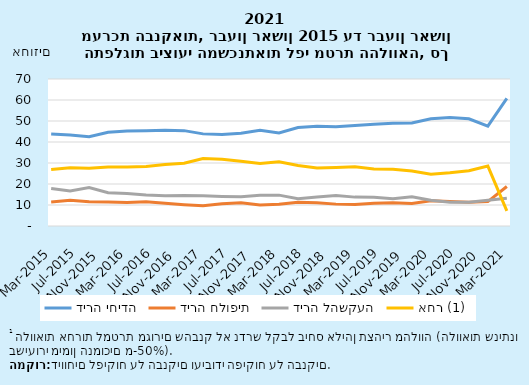
| Category | דירה יחידה | דירה חלופית | דירה להשקעה | אחר (1) |
|---|---|---|---|---|
| 2015-03-31 | 43.846 | 11.422 | 17.819 | 26.912 |
| 2015-06-30 | 43.333 | 12.259 | 16.632 | 27.776 |
| 2015-09-30 | 42.514 | 11.589 | 18.353 | 27.543 |
| 2015-12-31 | 44.651 | 11.475 | 15.836 | 28.039 |
| 2016-03-31 | 45.206 | 11.141 | 15.499 | 28.155 |
| 2016-06-30 | 45.386 | 11.59 | 14.716 | 28.307 |
| 2016-09-30 | 45.551 | 10.839 | 14.365 | 29.245 |
| 2016-12-31 | 45.41 | 10.155 | 14.511 | 29.923 |
| 2017-03-31 | 43.868 | 9.663 | 14.36 | 32.109 |
| 2017-06-30 | 43.597 | 10.547 | 14.094 | 31.762 |
| 2017-09-30 | 44.173 | 11.04 | 13.977 | 30.811 |
| 2017-12-31 | 45.602 | 10.014 | 14.641 | 29.743 |
| 2018-03-31 | 44.301 | 10.399 | 14.698 | 30.602 |
| 2018-06-30 | 46.869 | 11.323 | 13.03 | 28.779 |
| 2018-09-30 | 47.461 | 11.113 | 13.77 | 27.655 |
| 2018-12-31 | 47.237 | 10.416 | 14.52 | 27.826 |
| 2019-03-31 | 47.844 | 10.239 | 13.75 | 28.167 |
| 2019-06-30 | 48.427 | 10.799 | 13.646 | 27.129 |
| 2019-09-30 | 48.922 | 11.118 | 12.969 | 26.99 |
| 2019-12-31 | 49.105 | 10.758 | 13.909 | 26.228 |
| 2020-03-31 | 51.073 | 12.01 | 12.265 | 24.651 |
| 2020-06-30 | 51.65 | 11.686 | 11.284 | 25.381 |
| 2020-09-30 | 51.042 | 11.274 | 11.329 | 26.354 |
| 2020-12-31 | 47.562 | 11.599 | 12.299 | 28.54 |
| 2021-03-31 | 60.73 | 18.819 | 13.247 | 7.204 |